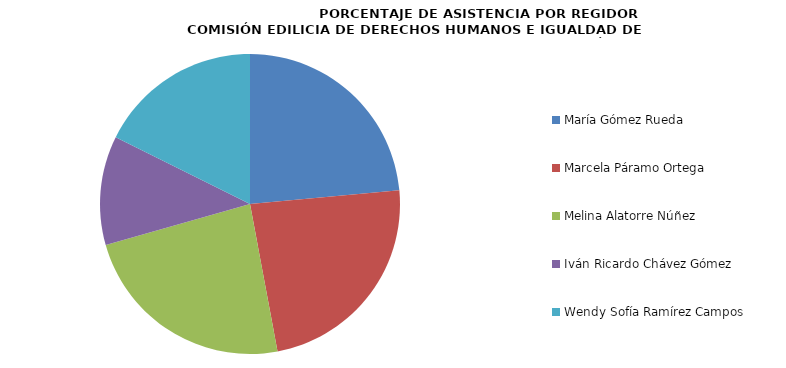
| Category | Series 0 |
|---|---|
| María Gómez Rueda | 100 |
| Marcela Páramo Ortega | 100 |
| Melina Alatorre Núñez | 100 |
| Iván Ricardo Chávez Gómez | 50 |
| Wendy Sofía Ramírez Campos | 75 |